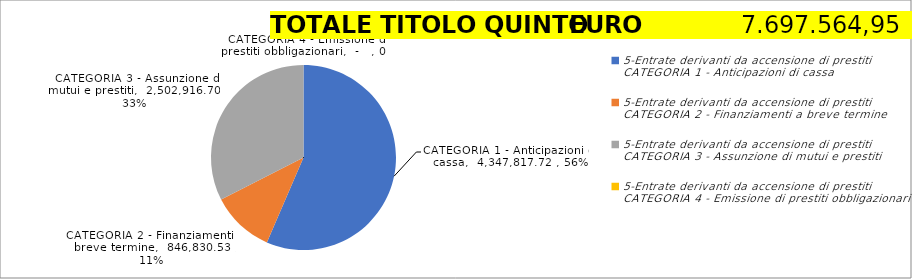
| Category | Series 0 |
|---|---|
| 0 | 4347817.72 |
| 1 | 846830.53 |
| 2 | 2502916.7 |
| 3 | 0 |